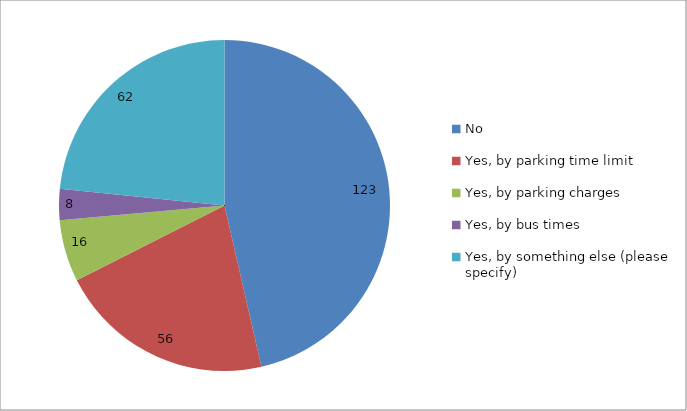
| Category | Series 0 |
|---|---|
| No | 123 |
| Yes, by parking time limit | 56 |
| Yes, by parking charges | 16 |
| Yes, by bus times | 8 |
| Yes, by something else (please specify) | 62 |